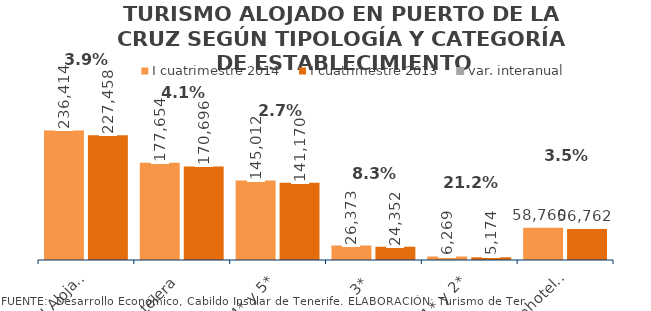
| Category | I cuatrimestre 2014 | I cuatrimestre 2013 |
|---|---|---|
| Total Alojados | 236414 | 227458 |
| Hotelera | 177654 | 170696 |
| 4* y 5* | 145012 | 141170 |
| 3* | 26373 | 24352 |
| 1* y 2* | 6269 | 5174 |
| Extrahotelera | 58760 | 56762 |